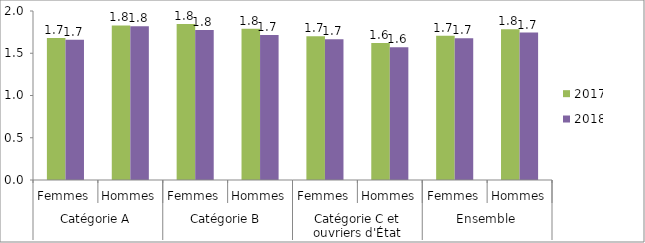
| Category | 2017 | 2018 |
|---|---|---|
| 0 | 1.679 | 1.659 |
| 1 | 1.829 | 1.818 |
| 2 | 1.845 | 1.774 |
| 3 | 1.791 | 1.716 |
| 4 | 1.701 | 1.666 |
| 5 | 1.62 | 1.571 |
| 6 | 1.707 | 1.677 |
| 7 | 1.784 | 1.745 |